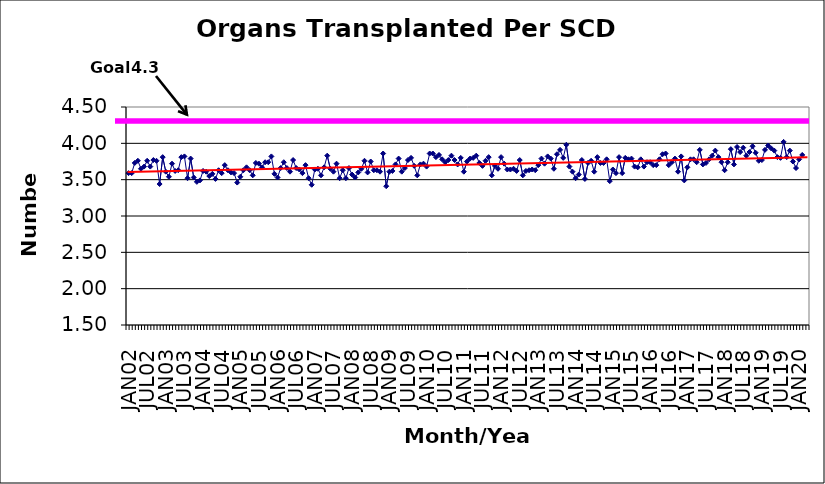
| Category | Series 0 |
|---|---|
| JAN02 | 3.59 |
| FEB02 | 3.59 |
| MAR02 | 3.73 |
| APR02 | 3.76 |
| MAY02 | 3.65 |
| JUN02 | 3.68 |
| JUL02 | 3.76 |
| AUG02 | 3.68 |
| SEP02 | 3.77 |
| OCT02 | 3.76 |
| NOV02 | 3.44 |
| DEC02 | 3.81 |
| JAN03 | 3.61 |
| FEB03 | 3.54 |
| MAR03 | 3.72 |
| APR03 | 3.62 |
| MAY03 | 3.63 |
| JUN03 | 3.81 |
| JUL03 | 3.82 |
| AUG03 | 3.52 |
| SEP03 | 3.79 |
| OCT03 | 3.53 |
| NOV03 | 3.47 |
| DEC03 | 3.49 |
| JAN04 | 3.62 |
| FEB04 | 3.61 |
| MAR04 | 3.55 |
| APR04 | 3.58 |
| MAY04 | 3.51 |
| JUN04 | 3.63 |
| JUL04 | 3.59 |
| AUG04 | 3.7 |
| SEP04 | 3.63 |
| OCT04 | 3.6 |
| NOV04 | 3.59 |
| DEC04 | 3.46 |
| JAN05 | 3.54 |
| FEB05 | 3.63 |
| MAR05 | 3.67 |
| APR05 | 3.63 |
| MAY05 | 3.56 |
| JUN05 | 3.73 |
| JUL05 | 3.72 |
| AUG05 | 3.67 |
| SEP05 | 3.74 |
| OCT05 | 3.74 |
| NOV05 | 3.82 |
| DEC05 | 3.58 |
| JAN06 | 3.53 |
| FEB06 | 3.66 |
| MAR06 | 3.74 |
| APR06 | 3.66 |
| MAY06 | 3.61 |
| JUN06 | 3.77 |
| JUL06 | 3.66 |
| AUG06 | 3.64 |
| SEP06 | 3.59 |
| OCT06 | 3.7 |
| NOV06 | 3.52 |
| DEC06 | 3.43 |
| JAN07 | 3.64 |
| FEB07 | 3.65 |
| MAR07 | 3.56 |
| APR07 | 3.67 |
| MAY07 | 3.83 |
| JUN07 | 3.65 |
| JUL07 | 3.61 |
| AUG07 | 3.72 |
| SEP07 | 3.52 |
| OCT07 | 3.63 |
| NOV07 | 3.52 |
| DEC07 | 3.66 |
| JAN08 | 3.57 |
| FEB08 | 3.53 |
| MAR08 | 3.6 |
| APR08 | 3.65 |
| MAY08 | 3.76 |
| JUN08 | 3.6 |
| JUL08 | 3.75 |
| AUG08 | 3.63 |
| SEP08 | 3.63 |
| OCT08 | 3.61 |
| NOV08 | 3.86 |
| DEC08 | 3.41 |
| JAN09 | 3.61 |
| FEB09 | 3.62 |
| MAR09 | 3.71 |
| APR09 | 3.79 |
| MAY09 | 3.61 |
| JUN09 | 3.66 |
| JUL09 | 3.77 |
| AUG09 | 3.8 |
| SEP09 | 3.69 |
| OCT09 | 3.56 |
| NOV09 | 3.71 |
| DEC09 | 3.72 |
| JAN10 | 3.68 |
| FEB10 | 3.86 |
| MAR10 | 3.86 |
| APR10 | 3.81 |
| MAY10 | 3.84 |
| JUN10 | 3.78 |
| JUL10 | 3.74 |
| AUG10 | 3.77 |
| SEP10 | 3.83 |
| OCT10 | 3.77 |
| NOV10 | 3.71 |
| DEC10 | 3.8 |
| JAN11 | 3.61 |
| FEB11 | 3.75 |
| MAR11 | 3.79 |
| APR11 | 3.8 |
| MAY11 | 3.83 |
| JUN11 | 3.73 |
| JUL11 | 3.69 |
| AUG11 | 3.76 |
| SEP11 | 3.81 |
| OCT11 | 3.56 |
| NOV11 | 3.69 |
| DEC11 | 3.65 |
| JAN12 | 3.81 |
| FEB12 | 3.72 |
| MAR12 | 3.64 |
| APR12 | 3.64 |
| MAY12 | 3.65 |
| JUN12 | 3.62 |
| JUL12 | 3.77 |
| AUG12 | 3.56 |
| SEP12 | 3.62 |
| OCT12 | 3.63 |
| NOV12 | 3.64 |
| DEC12 | 3.63 |
| JAN13 | 3.7 |
| FEB13 | 3.79 |
| MAR13 | 3.72 |
| APR13 | 3.82 |
| MAY13 | 3.79 |
| JUN13 | 3.65 |
| JUL13 | 3.85 |
| AUG13 | 3.91 |
| SEP13 | 3.8 |
| OCT13 | 3.98 |
| NOV13 | 3.68 |
| DEC13 | 3.61 |
| JAN14 | 3.52 |
| FEB14 | 3.57 |
| MAR14 | 3.77 |
| APR14 | 3.51 |
| MAY14 | 3.73 |
| JUN14 | 3.76 |
| JUL14 | 3.61 |
| AUG14 | 3.81 |
| SEP14 | 3.73 |
| OCT14 | 3.73 |
| NOV14 | 3.78 |
| DEC14 | 3.48 |
| JAN15 | 3.64 |
| FEB15 | 3.59 |
| MAR15 | 3.81 |
| APR15 | 3.59 |
| MAY15 | 3.8 |
| JUN15 | 3.78 |
| JUL15 | 3.79 |
| AUG15 | 3.68 |
| SEP15 | 3.67 |
| OCT15 | 3.78 |
| NOV15 | 3.68 |
| DEC15 | 3.74 |
| JAN16 | 3.74 |
| FEB16 | 3.7 |
| MAR16 | 3.7 |
| APR16 | 3.78 |
| MAY16 | 3.85 |
| JUN16 | 3.86 |
| JUL16 | 3.7 |
| AUG16 | 3.74 |
| SEP16 | 3.79 |
| OCT16 | 3.61 |
| NOV16 | 3.82 |
| DEC16 | 3.49 |
| JAN17 | 3.67 |
| FEB17 | 3.78 |
| MAR17 | 3.78 |
| APR17 | 3.74 |
| MAY17 | 3.91 |
| JUN17 | 3.71 |
| JUL17 | 3.73 |
| AUG17 | 3.78 |
| SEP17 | 3.83 |
| OCT17 | 3.9 |
| NOV17 | 3.81 |
| DEC17 | 3.74 |
| JAN18 | 3.63 |
| FEB18 | 3.74 |
| MAR18 | 3.92 |
| APR18 | 3.71 |
| MAY18 | 3.95 |
| JUN18 | 3.88 |
| JUL18 | 3.94 |
| AUG18 | 3.83 |
| SEP18 | 3.88 |
| OCT18 | 3.96 |
| NOV18 | 3.87 |
| DEC18 | 3.76 |
| JAN19 | 3.77 |
| FEB19 | 3.91 |
| MAR19 | 3.97 |
| APR19 | 3.93 |
| MAY19 | 3.9 |
| JUN19 | 3.81 |
| JUL19 | 3.8 |
| AUG19 | 4.02 |
| SEP19 | 3.81 |
| OCT19 | 3.9 |
| NOV19 | 3.75 |
| DEC19 | 3.66 |
| JAN20 | 3.78 |
| FEB20 | 3.84 |